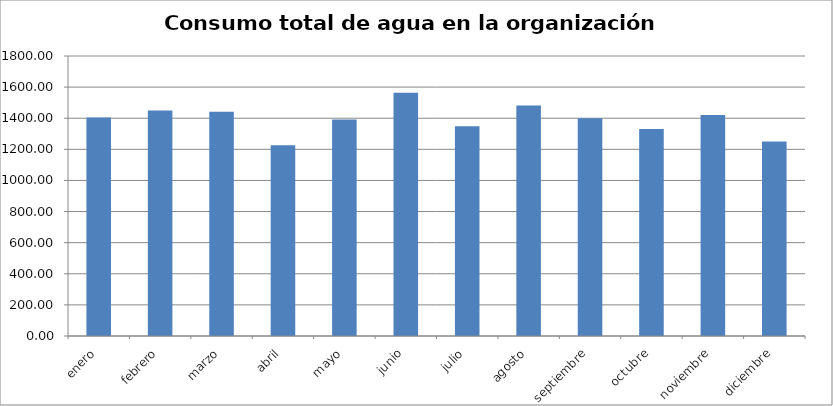
| Category | Series 0 |
|---|---|
| enero | 1404 |
| febrero | 1450 |
| marzo | 1441 |
| abril | 1227 |
| mayo | 1391 |
| junio | 1563 |
| julio | 1348 |
| agosto | 1482 |
| septiembre | 1400 |
| octubre | 1331 |
| noviembre | 1420 |
| diciembre | 1250 |